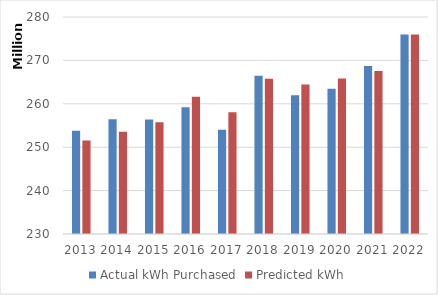
| Category | Actual kWh Purchased | Predicted kWh |
|---|---|---|
| 2013.0 | 253794532.286 | 251533693.589 |
| 2014.0 | 256463675.284 | 253556301.026 |
| 2015.0 | 256374688.637 | 255727922.662 |
| 2016.0 | 259210018.64 | 261639329.472 |
| 2017.0 | 254048366.9 | 258052709.489 |
| 2018.0 | 266473255.972 | 265791999.935 |
| 2019.0 | 261985353.56 | 264427475.994 |
| 2020.0 | 263490930.2 | 265846091.207 |
| 2021.0 | 268727922 | 267553382.386 |
| 2022.0 | 275977471.304 | 275977471.304 |